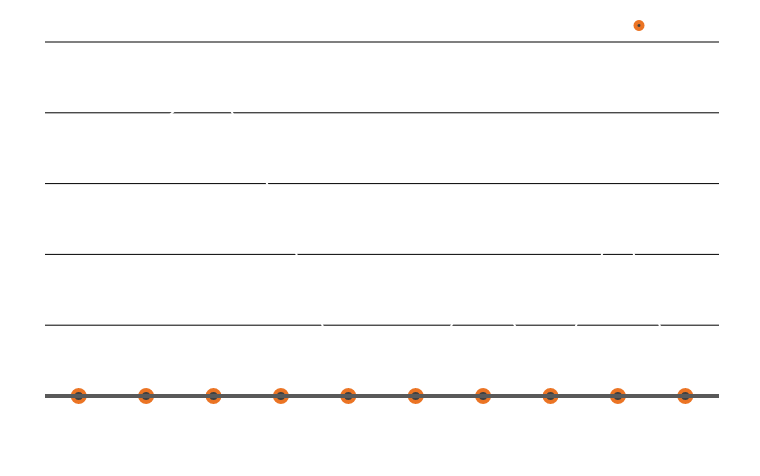
| Category | Milhas Dirigidas |
|---|---|
| 5/1/12 | 162 |
| 5/2/12 | 183 |
| 5/3/12 | 227 |
| 5/4/12 | 130 |
| 5/5/12 | 0 |
| 5/6/12 | 0 |
| 5/7/12 | 94 |
| 5/8/12 | 0 |
| 5/9/12 | 131 |
| 5/10/12 | 0 |